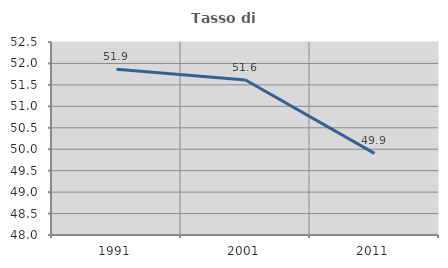
| Category | Tasso di occupazione   |
|---|---|
| 1991.0 | 51.865 |
| 2001.0 | 51.613 |
| 2011.0 | 49.904 |